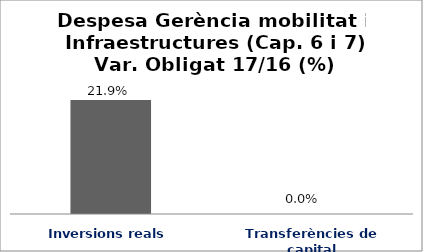
| Category | Series 0 |
|---|---|
| Inversions reals | 0.219 |
| Transferències de capital | 0 |